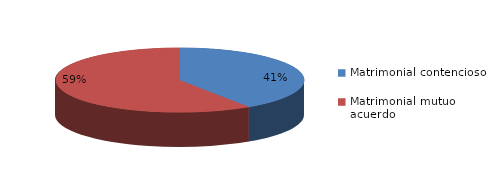
| Category | Series 0 |
|---|---|
| 0 | 2055 |
| 1 | 3001 |